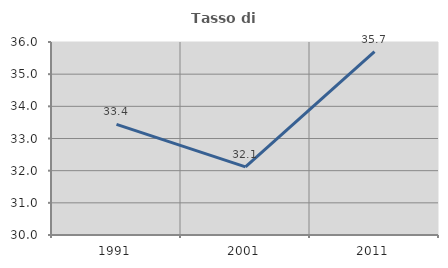
| Category | Tasso di occupazione   |
|---|---|
| 1991.0 | 33.441 |
| 2001.0 | 32.117 |
| 2011.0 | 35.701 |